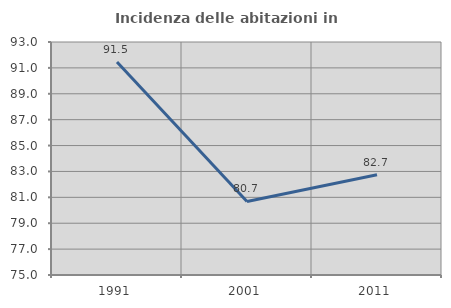
| Category | Incidenza delle abitazioni in proprietà  |
|---|---|
| 1991.0 | 91.451 |
| 2001.0 | 80.685 |
| 2011.0 | 82.741 |